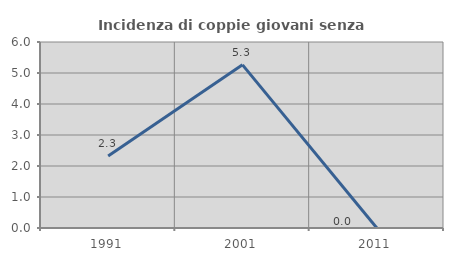
| Category | Incidenza di coppie giovani senza figli |
|---|---|
| 1991.0 | 2.326 |
| 2001.0 | 5.263 |
| 2011.0 | 0 |